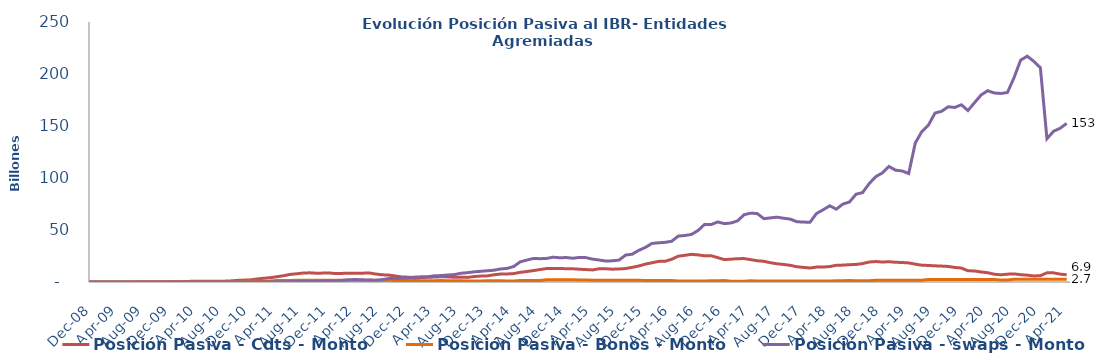
| Category | Posición Pasiva - Cdts - Monto | Posición Pasiva - Bonos - Monto | Posición Pasiva - swaps - Monto |
|---|---|---|---|
| 2008-07-01 | 0 | 0 | 0 |
| 2008-08-01 | 0 | 0 | 0 |
| 2008-09-01 | 1000000 | 0 | 0 |
| 2008-10-01 | 1000000 | 0 | 0 |
| 2008-11-01 | 0 | 0 | 0 |
| 2008-12-01 | 0 | 0 | 0 |
| 2009-01-01 | 0 | 0 | 0 |
| 2009-02-01 | 0 | 0 | 0 |
| 2009-03-01 | 0 | 0 | 0 |
| 2009-04-01 | 0 | 0 | 0 |
| 2009-05-01 | 0 | 0 | 0 |
| 2009-06-01 | 0 | 0 | 0 |
| 2009-07-01 | 0 | 177200000000 | 0 |
| 2009-08-01 | 0 | 177200000000 | 0 |
| 2009-09-01 | 0 | 177200000000 | 0 |
| 2009-10-01 | 1000000 | 177200000000 | 0 |
| 2009-11-01 | 133701000000 | 177200000000 | 0 |
| 2009-12-01 | 307701000000 | 177200000000 | 700000000 |
| 2010-01-01 | 320201000000 | 177200000000 | 2600000000 |
| 2010-02-01 | 357551000000 | 177200000000 | 3500000000 |
| 2010-03-01 | 655371000000 | 192000000000 | 19200000000 |
| 2010-04-01 | 675721000000 | 192000000000 | 34200000000 |
| 2010-05-01 | 681721000000 | 192000000000 | 51500000000 |
| 2010-06-01 | 705721000000 | 205600000000 | 50500000000 |
| 2010-07-01 | 737221000000 | 205600000000 | 40000000000 |
| 2010-08-01 | 785721000000 | 205600000000 | 39000000000 |
| 2010-09-01 | 1033321000000 | 205600000000 | 55000000000 |
| 2010-10-01 | 1530639000000 | 392650000000 | 52000000000 |
| 2010-11-01 | 1811289030230 | 743290000000 | 58000000000 |
| 2010-12-01 | 2062699030230 | 962710000000 | 66000000000 |
| 2011-01-01 | 2879749030230 | 807496000000 | 89000000000 |
| 2011-02-01 | 3592057311520 | 807496000000 | 121000000000 |
| 2011-03-01 | 4094394311520 | 994310000000 | 109000000000 |
| 2011-04-01 | 5034075281290 | 1342146000000 | 153000000000 |
| 2011-05-01 | 5963198881774 | 1342146000000 | 197000000000 |
| 2011-06-01 | 7250771346191 | 1342146000000 | 367000000000 |
| 2011-07-01 | 7889921570652 | 1675923000000 | 437000000000 |
| 2011-08-01 | 8556448085668 | 1578873000000 | 462000000000 |
| 2011-09-01 | 8833885282168 | 1635362000000 | 475000000000 |
| 2011-10-01 | 8457699585668 | 1767199000000 | 614000000000 |
| 2011-11-01 | 8549620287184 | 1767199000000 | 875000000000 |
| 2011-12-01 | 8705544763684 | 1767199000000 | 833000000000 |
| 2012-01-01 | 8049489811238 | 1767199000000 | 876000000000 |
| 2012-02-01 | 8270462411238 | 1767199000000 | 1563000000000 |
| 2012-03-01 | 8518277207338 | 1737198999996 | 2146000000000 |
| 2012-04-01 | 8443527467338 | 1737199000000 | 2394500000000 |
| 2012-05-01 | 8450299073338 | 1760649000000 | 2078750000000 |
| 2012-06-01 | 8778980763536 | 1608181000000 | 1904350000000 |
| 2012-07-01 | 7700629135460 | 1608181000000 | 1698707000000 |
| 2012-08-01 | 6932102972154 | 1608181000000 | 2198807000000 |
| 2012-09-01 | 6675552972154 | 1608181000000 | 3297552000000 |
| 2012-10-01 | 5825952472154 | 1516631000000 | 3592517000000 |
| 2012-11-01 | 4826904430154 | 1510256000000 | 3782805083331 |
| 2012-12-01 | 4650075554154 | 1509355000000 | 4185362081845 |
| 2013-01-01 | 4016525414921 | 1509354931416.67 | 4692538642439 |
| 2013-02-01 | 4272243181883 | 1147770000000 | 4990298764579 |
| 2013-03-01 | 4558993181883 | 1113970000000 | 5067351034108 |
| 2013-04-01 | 4748821181883 | 1159013000000 | 6003435133053 |
| 2013-05-01 | 5020504181883 | 1390113000000 | 6169552742390.75 |
| 2013-06-01 | 4908852681883 | 1300113000000 | 6705676089087.75 |
| 2013-07-01 | 4542666412950 | 1300097600000 | 7144037698575.75 |
| 2013-08-01 | 4538035699500 | 1259904100000 | 8418505206190.25 |
| 2013-09-01 | 4426905198533 | 1015652000000 | 8994300517255.25 |
| 2013-10-01 | 5259004198533 | 923402000000 | 9766983899621.8 |
| 2013-11-01 | 5660733384614 | 974762000000 | 10300441787153.8 |
| 2013-12-01 | 5893893284614 | 1235400000000 | 10801537325169.8 |
| 2014-01-01 | 6933122579068 | 1235400000000 | 11307303837792.8 |
| 2014-02-01 | 7613677579068 | 1235400000000 | 12524983899621.8 |
| 2014-03-01 | 7717362579068 | 936600000000 | 13071266927788.8 |
| 2014-04-01 | 8082318579068 | 1057300000000 | 14850725938985.8 |
| 2014-05-01 | 9299683175517 | 1439566000000 | 19403141857606.23 |
| 2014-06-01 | 10084195252517 | 1550812908000 | 21076466392867.23 |
| 2014-07-01 | 10972302777723 | 1550417621000 | 22642710423754.09 |
| 2014-08-01 | 11972062686643 | 1337912000000 | 22412814812363.438 |
| 2014-09-01 | 12905707081780.31 | 2154227000000 | 22678622315786.43 |
| 2014-10-01 | 13063246210954.844 | 2244227000000 | 23852851304721.203 |
| 2014-11-01 | 12953854419948.99 | 2244227000000 | 23294758403938.21 |
| 2014-12-01 | 12797175147981.03 | 2244227000000 | 23527533950320.21 |
| 2015-01-01 | 12735464045472.7 | 2244227000000 | 22844089310976.43 |
| 2015-02-01 | 12258740520049.02 | 1967427000000 | 23616016822770.98 |
| 2015-03-01 | 11959675084873.94 | 1922546000000 | 23429845881131.43 |
| 2015-04-01 | 11603104146348.63 | 1731531000000 | 21954905217570.633 |
| 2015-05-01 | 12787258765586.06 | 1731531000000 | 21137165704294.71 |
| 2015-06-01 | 12702350124119.61 | 1731531000000 | 20116838167751.242 |
| 2015-07-01 | 12326873613850.61 | 1731531000000 | 20375523033390.5 |
| 2015-08-01 | 12532631352445.61 | 1731531000000 | 21044174373204.39 |
| 2015-09-01 | 12914314312021.61 | 1731531000000 | 25886053422220.67 |
| 2015-10-01 | 14078324826522.61 | 1731531000000 | 26724546866995.008 |
| 2015-11-01 | 15387895261461.13 | 1790331000000 | 30433131895803.133 |
| 2015-12-01 | 17198106299339.13 | 1474516000000 | 33218498858606.953 |
| 2016-01-01 | 18471252279786.94 | 1474516000000 | 37083234558973.01 |
| 2016-02-01 | 19820074498199.3 | 1474516000000 | 37698368402074.71 |
| 2016-03-01 | 19910995635360.5 | 1559516000000 | 38121885099841.87 |
| 2016-04-01 | 21872523250119.66 | 1466816000000 | 39141783058519.24 |
| 2016-05-01 | 24813127348002.38 | 1059116000000 | 44164977934302.15 |
| 2016-06-01 | 25637146394228.258 | 1059116000000 | 44728113292988.33 |
| 2016-07-01 | 26607711640580.258 | 1059116000000 | 45705606091662.73 |
| 2016-08-01 | 26048927395012.82 | 1059116000000 | 49517526483113.3 |
| 2016-09-01 | 25202974900085.754 | 1059787036612.9 | 55398854669509.74 |
| 2016-10-01 | 25284571899756.367 | 1151562066774.19 | 55242666617988.44 |
| 2016-11-01 | 23434547096864.77 | 1150981261774.19 | 57761956184631.16 |
| 2016-12-01 | 21535959293189.84 | 1501604591451.61 | 56119119443202.05 |
| 2017-01-01 | 21950343369064.71 | 700243000000 | 56716284030347.41 |
| 2017-02-01 | 22437913541124.71 | 700243000000 | 58757499650223.12 |
| 2017-03-01 | 22508699373693.71 | 700243000000 | 64704229108276.48 |
| 2017-04-01 | 21508774970839.19 | 1133243000000 | 66211606669941.06 |
| 2017-05-01 | 20451439388511.71 | 1068411000000 | 65777253859007.76 |
| 2017-06-01 | 19911066434349.71 | 1068411000000 | 60894933619234.93 |
| 2017-07-01 | 18525251185322.71 | 976568000000 | 61635888515859.08 |
| 2017-08-01 | 17501216922547.781 | 976568000000 | 62349645714459.99 |
| 2017-09-01 | 16861503696848.07 | 891568000000 | 61287373903049.51 |
| 2017-10-01 | 16033651202236.707 | 891568000000 | 60491496582725.68 |
| 2017-11-01 | 14663855718312.71 | 891568000000 | 57968503538179.62 |
| 2017-12-01 | 14029447776466.201 | 891568000000 | 57632652407339.234 |
| 2018-01-01 | 13473477511044.71 | 891568000000 | 57392798372781.125 |
| 2018-02-01 | 14345353584382.71 | 891568000000 | 65871665857879.45 |
| 2018-03-01 | 14384191776904.707 | 891568000000 | 69411275754893.83 |
| 2018-04-01 | 14844263302225.71 | 918568000000 | 73289911574145.83 |
| 2018-05-01 | 16052886454266.71 | 1118568000000 | 70046783961295.945 |
| 2018-06-01 | 16243945147454.24 | 1118568000000 | 74916667687352.02 |
| 2018-07-01 | 16635494229855.71 | 1407568000000 | 76887213001782.36 |
| 2018-08-01 | 16851916145165.71 | 1261500000000 | 84402981257829.3 |
| 2018-09-01 | 17741041145165.71 | 1259000000000 | 86020631843693.48 |
| 2018-10-01 | 19205478628953.5 | 1258999999164.99 | 94613317771893.92 |
| 2018-11-01 | 19659598677128.79 | 1627030000000 | 101300492312826.36 |
| 2018-12-01 | 19206685075128.79 | 1627030000000 | 104883673702985.12 |
| 2019-01-01 | 19486763643454.664 | 1627030000000 | 111103390660546.89 |
| 2019-02-01 | 18970941687646.89 | 1627030000000 | 107501227199297.78 |
| 2019-03-01 | 18754890853470.266 | 1627030000000 | 106776186595081.17 |
| 2019-04-01 | 18347443914782.69 | 1654830000000 | 104284947187587.81 |
| 2019-05-01 | 17157834496300 | 1627030000000 | 133658510077641.11 |
| 2019-06-01 | 16128373592479.15 | 1627030000000 | 144665517254733.94 |
| 2019-07-01 | 15902851646300 | 2284030000000 | 150930692755760.22 |
| 2019-08-01 | 15563560011866.97 | 2284030000000 | 162448663120908.5 |
| 2019-09-01 | 15288853777637 | 2284030000000 | 164146968295123.03 |
| 2019-10-01 | 14962283507837 | 2284030000000 | 168498536410506.4 |
| 2019-11-01 | 13992481472649.271 | 2284030000000 | 167832819482332.1 |
| 2019-12-01 | 13437389275848.19 | 2284030000000 | 170403680265263.12 |
| 2020-01-01 | 10792304150848.19 | 2284030000000 | 164875864625285.28 |
| 2020-02-01 | 10621307150848.2 | 2284030000000 | 172438609043773.94 |
| 2020-03-01 | 9634687031848.2 | 2284030000000 | 179838083004412.78 |
| 2020-04-01 | 8925311704791.2 | 2284030000000 | 183940023869518.72 |
| 2020-05-01 | 7474954328595.2 | 2284030000000 | 181742825754236.7 |
| 2020-06-01 | 6938154328595.2 | 2035030000000 | 181280066860963.4 |
| 2020-07-01 | 7523954328595.2 | 2035030000000 | 182220560497189.62 |
| 2020-08-01 | 7806933343547.2 | 2545570000000 | 196487852570208.34 |
| 2020-09-01 | 7023181446747.2 | 2679670000000 | 213290281606705.34 |
| 2020-10-01 | 6576977150000.2 | 2679670000000 | 217138497539225 |
| 2020-11-01 | 5797977150000.2 | 2529670000000 | 212245450099917.03 |
| 2020-12-01 | 6100858000000.2 | 2529670000000 | 206040227843577.16 |
| 2021-01-01 | 8834073616318 | 2679670000000 | 137780602671042.3 |
| 2021-02-01 | 8780996523218 | 2679670000000 | 144956815605194.94 |
| 2021-03-01 | 7562180429860.2 | 2677670000000 | 147809416640590.84 |
| 2021-04-01 | 6944667229860 | 2677670000000 | 152501282871576.88 |